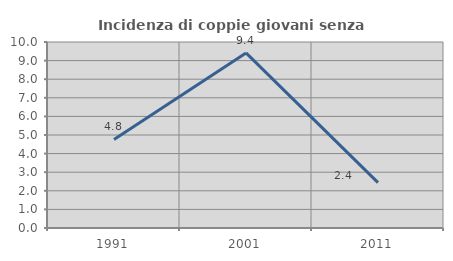
| Category | Incidenza di coppie giovani senza figli |
|---|---|
| 1991.0 | 4.762 |
| 2001.0 | 9.412 |
| 2011.0 | 2.439 |